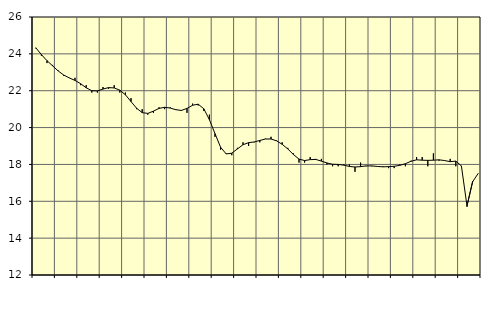
| Category | Piggar | Tillverkning o utvinning, energi o miljö, SNI 05-33, 35-39 |
|---|---|---|
| nan | 24.3 | 24.33 |
| 1.0 | 23.9 | 23.96 |
| 1.0 | 23.5 | 23.63 |
| 1.0 | 23.4 | 23.35 |
| nan | 23.1 | 23.07 |
| 2.0 | 22.8 | 22.85 |
| 2.0 | 22.7 | 22.69 |
| 2.0 | 22.7 | 22.56 |
| nan | 22.3 | 22.38 |
| 3.0 | 22.3 | 22.16 |
| 3.0 | 21.9 | 22 |
| 3.0 | 21.9 | 21.99 |
| nan | 22.2 | 22.09 |
| 4.0 | 22.1 | 22.17 |
| 4.0 | 22.3 | 22.15 |
| 4.0 | 21.9 | 22.03 |
| nan | 21.9 | 21.78 |
| 5.0 | 21.6 | 21.41 |
| 5.0 | 21 | 21.05 |
| 5.0 | 21 | 20.81 |
| nan | 20.7 | 20.77 |
| 6.0 | 20.8 | 20.89 |
| 6.0 | 21.1 | 21.04 |
| 6.0 | 21 | 21.1 |
| nan | 21.1 | 21.06 |
| 7.0 | 21 | 20.97 |
| 7.0 | 20.9 | 20.93 |
| 7.0 | 20.8 | 21.04 |
| nan | 21.3 | 21.21 |
| 8.0 | 21.2 | 21.27 |
| 8.0 | 20.9 | 21.02 |
| 8.0 | 20.7 | 20.43 |
| nan | 19.5 | 19.67 |
| 9.0 | 18.8 | 18.93 |
| 9.0 | 18.6 | 18.57 |
| 9.0 | 18.5 | 18.61 |
| nan | 18.9 | 18.84 |
| 10.0 | 19.2 | 19.07 |
| 10.0 | 19 | 19.18 |
| 10.0 | 19.2 | 19.22 |
| nan | 19.2 | 19.3 |
| 11.0 | 19.4 | 19.38 |
| 11.0 | 19.5 | 19.38 |
| 11.0 | 19.3 | 19.28 |
| nan | 19.2 | 19.09 |
| 12.0 | 18.9 | 18.84 |
| 12.0 | 18.6 | 18.54 |
| 12.0 | 18.1 | 18.29 |
| nan | 18.1 | 18.21 |
| 13.0 | 18.4 | 18.26 |
| 13.0 | 18.3 | 18.27 |
| 13.0 | 18.3 | 18.18 |
| nan | 18 | 18.08 |
| 14.0 | 17.9 | 18.01 |
| 14.0 | 17.9 | 18 |
| 14.0 | 18 | 17.96 |
| nan | 18 | 17.89 |
| 15.0 | 17.6 | 17.86 |
| 15.0 | 18.1 | 17.88 |
| 15.0 | 17.9 | 17.92 |
| nan | 17.9 | 17.92 |
| 16.0 | 17.9 | 17.89 |
| 16.0 | 17.9 | 17.87 |
| 16.0 | 17.8 | 17.88 |
| nan | 17.8 | 17.9 |
| 17.0 | 18 | 17.95 |
| 17.0 | 17.9 | 18.04 |
| 17.0 | 18.2 | 18.17 |
| nan | 18.4 | 18.25 |
| 18.0 | 18.4 | 18.23 |
| 18.0 | 17.9 | 18.22 |
| 18.0 | 18.6 | 18.23 |
| nan | 18.2 | 18.25 |
| 19.0 | 18.2 | 18.21 |
| 19.0 | 18.3 | 18.15 |
| 19.0 | 17.9 | 18.18 |
| nan | 17.9 | 17.92 |
| 20.0 | 15.7 | 15.75 |
| 20.0 | 17.1 | 17.06 |
| 20.0 | 17.5 | 17.51 |